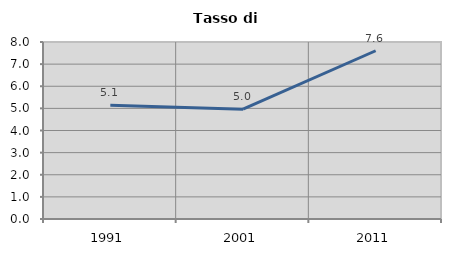
| Category | Tasso di disoccupazione   |
|---|---|
| 1991.0 | 5.137 |
| 2001.0 | 4.965 |
| 2011.0 | 7.605 |